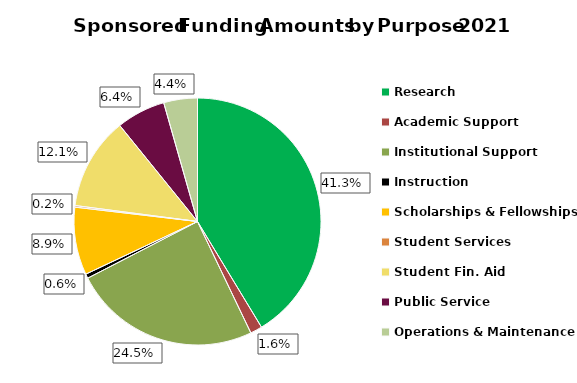
| Category | Series 0 |
|---|---|
| Research | 231110 |
| Academic Support | 8707 |
| Institutional Support | 137129 |
| Instruction | 3209 |
| Scholarships & Fellowships | 49585 |
| Student Services | 1164 |
| Student Fin. Aid | 67662 |
| Public Service | 35902 |
| Operations & Maintenance | 24670 |